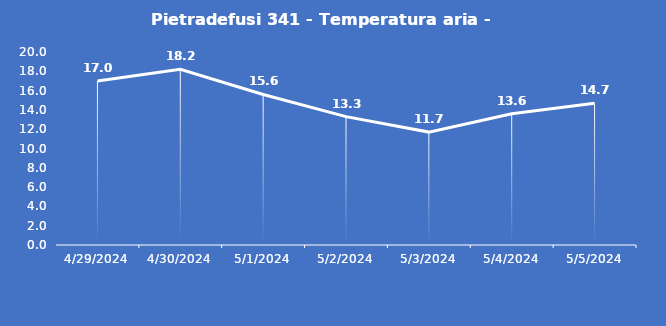
| Category | Pietradefusi 341 - Temperatura aria - Grezzo (°C) |
|---|---|
| 4/29/24 | 17 |
| 4/30/24 | 18.2 |
| 5/1/24 | 15.6 |
| 5/2/24 | 13.3 |
| 5/3/24 | 11.7 |
| 5/4/24 | 13.6 |
| 5/5/24 | 14.7 |